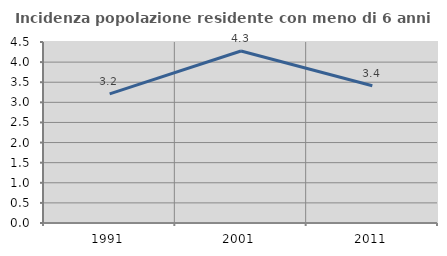
| Category | Incidenza popolazione residente con meno di 6 anni |
|---|---|
| 1991.0 | 3.209 |
| 2001.0 | 4.277 |
| 2011.0 | 3.412 |